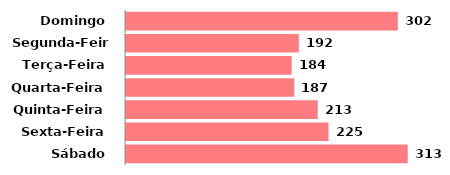
| Category | Qtde |
|---|---|
| Domingo | 302 |
| Segunda-Feira | 192 |
| Terça-Feira | 184 |
| Quarta-Feira | 187 |
| Quinta-Feira | 213 |
| Sexta-Feira | 225 |
| Sábado | 313 |